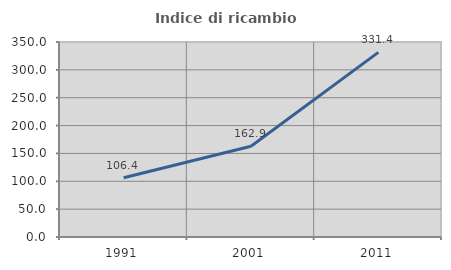
| Category | Indice di ricambio occupazionale  |
|---|---|
| 1991.0 | 106.413 |
| 2001.0 | 162.945 |
| 2011.0 | 331.395 |